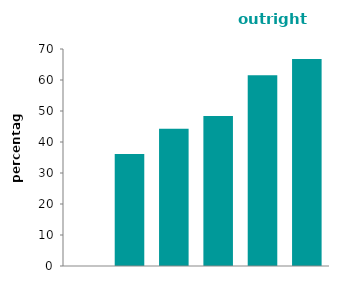
| Category | outright
owners |
|---|---|
| 16-24 | 0 |
| 25-34 | 36.163 |
| 35-44 | 44.24 |
| 45-54 | 48.388 |
| 55-64 | 61.553 |
| 65 or over | 66.735 |